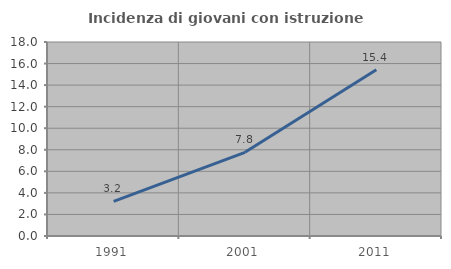
| Category | Incidenza di giovani con istruzione universitaria |
|---|---|
| 1991.0 | 3.215 |
| 2001.0 | 7.767 |
| 2011.0 | 15.419 |